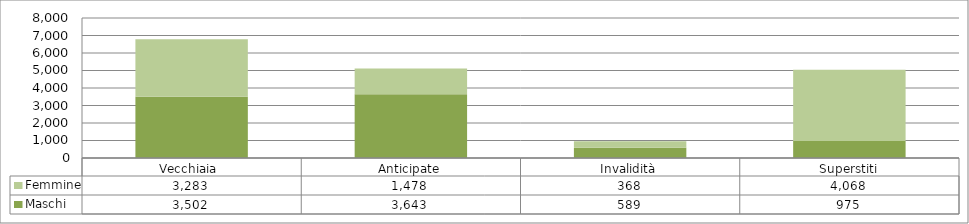
| Category | Maschi | Femmine |
|---|---|---|
| Vecchiaia  | 3502 | 3283 |
| Anticipate | 3643 | 1478 |
| Invalidità | 589 | 368 |
| Superstiti | 975 | 4068 |